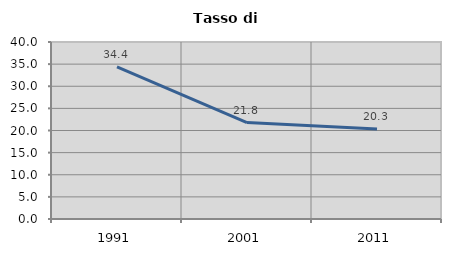
| Category | Tasso di disoccupazione   |
|---|---|
| 1991.0 | 34.363 |
| 2001.0 | 21.793 |
| 2011.0 | 20.348 |